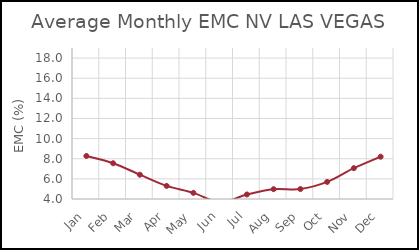
| Category | NV LAS VEGAS |
|---|---|
| Jan | 8.274 |
| Feb | 7.551 |
| Mar | 6.414 |
| Apr | 5.301 |
| May | 4.611 |
| Jun | 3.698 |
| Jul | 4.449 |
| Aug | 4.977 |
| Sep | 4.988 |
| Oct | 5.696 |
| Nov | 7.064 |
| Dec | 8.201 |